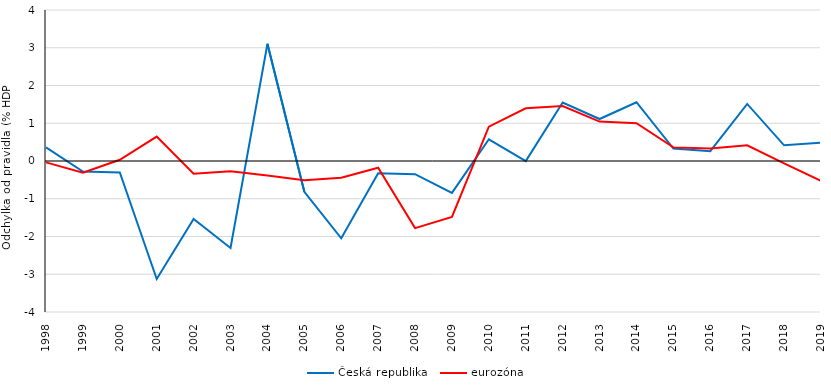
| Category | Česká republika | eurozóna |
|---|---|---|
| 1998.0 | 0.361 | -0.036 |
| 1999.0 | -0.278 | -0.308 |
| 2000.0 | -0.304 | 0.031 |
| 2001.0 | -3.125 | 0.647 |
| 2002.0 | -1.537 | -0.336 |
| 2003.0 | -2.302 | -0.275 |
| 2004.0 | 3.104 | -0.382 |
| 2005.0 | -0.816 | -0.509 |
| 2006.0 | -2.048 | -0.443 |
| 2007.0 | -0.323 | -0.178 |
| 2008.0 | -0.35 | -1.778 |
| 2009.0 | -0.844 | -1.481 |
| 2010.0 | 0.576 | 0.911 |
| 2011.0 | -0.001 | 1.396 |
| 2012.0 | 1.55 | 1.455 |
| 2013.0 | 1.112 | 1.043 |
| 2014.0 | 1.557 | 1.002 |
| 2015.0 | 0.33 | 0.361 |
| 2016.0 | 0.26 | 0.333 |
| 2017.0 | 1.511 | 0.414 |
| 2018.0 | 0.416 | -0.065 |
| 2019.0 | 0.487 | -0.526 |